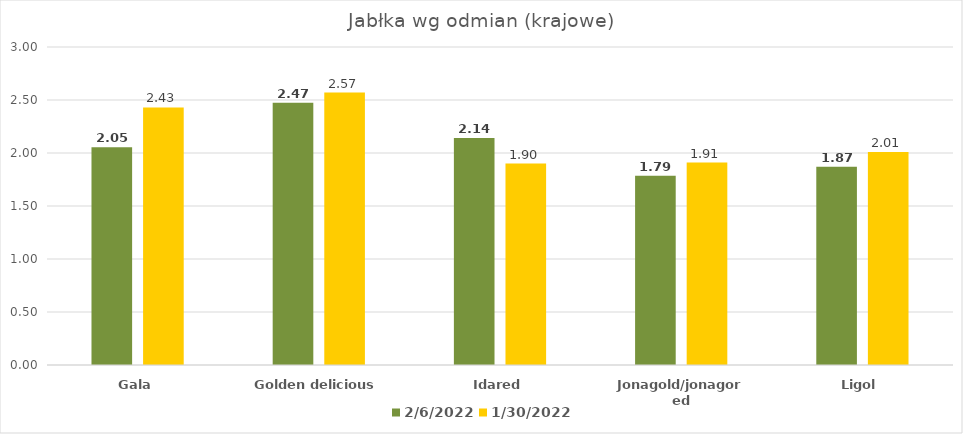
| Category | 2022-02-06 | 2022-01-30 |
|---|---|---|
| Gala | 2.055 | 2.43 |
| Golden delicious | 2.475 | 2.57 |
| Idared | 2.142 | 1.9 |
| Jonagold/jonagored | 1.786 | 1.91 |
| Ligol | 1.87 | 2.01 |